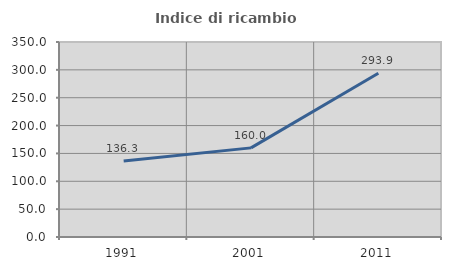
| Category | Indice di ricambio occupazionale  |
|---|---|
| 1991.0 | 136.275 |
| 2001.0 | 159.979 |
| 2011.0 | 293.853 |